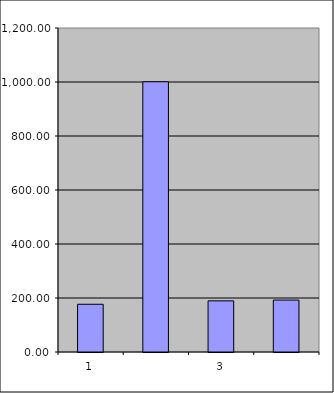
| Category | Series 0 |
|---|---|
| 0 | 176.75 |
| 1 | 1000.927 |
| 2 | 189.431 |
| 3 | 192.348 |